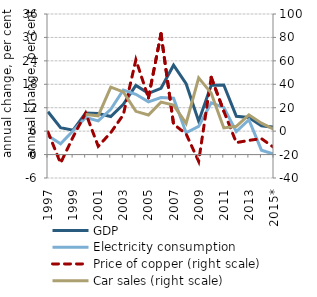
| Category | GDP | Electricity consumption |
|---|---|---|
| 1997 | 10.954 | 4.832 |
| 1998 | 6.875 | 2.783 |
| 1999 | 6.25 | 6.094 |
| 2000 | 10.635 | 9.488 |
| 2001 | 10.523 | 8.616 |
| 2002 | 9.737 | 11.604 |
| 2003 | 12.873 | 16.533 |
| 2004 | 17.711 | 15.447 |
| 2005 | 15.674 | 13.515 |
| 2006 | 16.966 | 14.624 |
| 2007 | 22.881 | 14.425 |
| 2008 | 18.146 | 5.593 |
| 2009 | 8.552 | 7.211 |
| 2010 | 17.779 | 13.243 |
| 2011 | 17.83 | 12.081 |
| 2012 | 9.8 | 5.883 |
| 2013 | 9.505 | 8.913 |
| 2014 | 7.375 | 1.128 |
| 2015* | 7 | 0.11 |